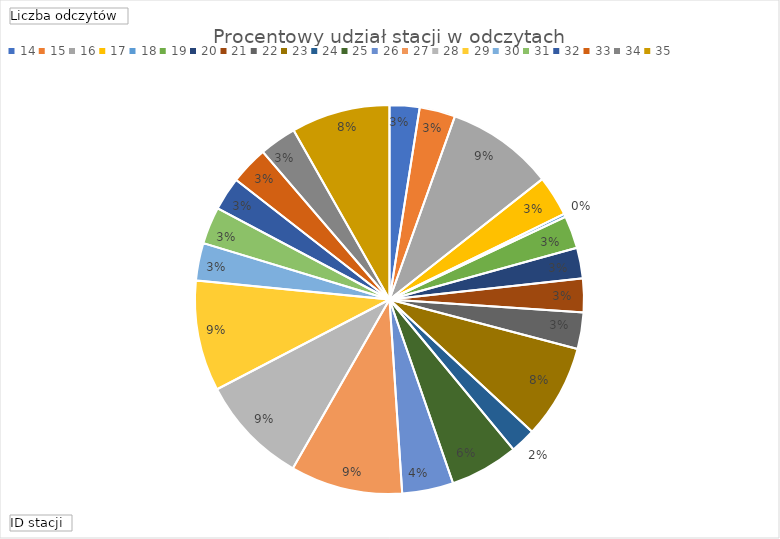
| Category | Suma |
|---|---|
| 14 | 87 |
| 15 | 104 |
| 16 | 312 |
| 17 | 118 |
| 18 | 9 |
| 19 | 95 |
| 20 | 89 |
| 21 | 98 |
| 22 | 106 |
| 23 | 273 |
| 24 | 74 |
| 25 | 199 |
| 26 | 149 |
| 27 | 326 |
| 28 | 318 |
| 29 | 322 |
| 30 | 109 |
| 31 | 108 |
| 32 | 97 |
| 33 | 111 |
| 34 | 108 |
| 35 | 287 |